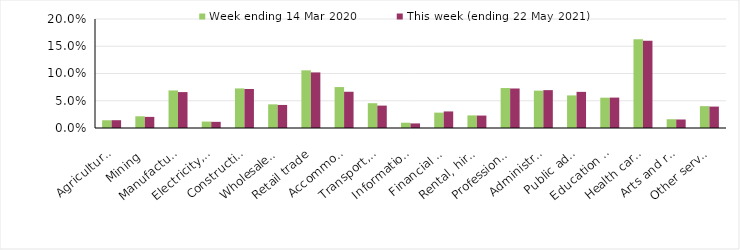
| Category | Week ending 14 Mar 2020 | This week (ending 22 May 2021) |
|---|---|---|
| Agriculture, forestry and fishing | 0.014 | 0.014 |
| Mining | 0.022 | 0.02 |
| Manufacturing | 0.069 | 0.066 |
| Electricity, gas, water and waste services | 0.012 | 0.011 |
| Construction | 0.073 | 0.072 |
| Wholesale trade | 0.043 | 0.042 |
| Retail trade | 0.106 | 0.102 |
| Accommodation and food services | 0.075 | 0.066 |
| Transport, postal and warehousing | 0.046 | 0.041 |
| Information media and telecommunications | 0.01 | 0.008 |
| Financial and insurance services | 0.028 | 0.03 |
| Rental, hiring and real estate services | 0.023 | 0.023 |
| Professional, scientific and technical services | 0.073 | 0.072 |
| Administrative and support services | 0.068 | 0.07 |
| Public administration and safety | 0.06 | 0.066 |
| Education and training | 0.056 | 0.056 |
| Health care and social assistance | 0.163 | 0.16 |
| Arts and recreation services | 0.016 | 0.016 |
| Other services | 0.04 | 0.039 |